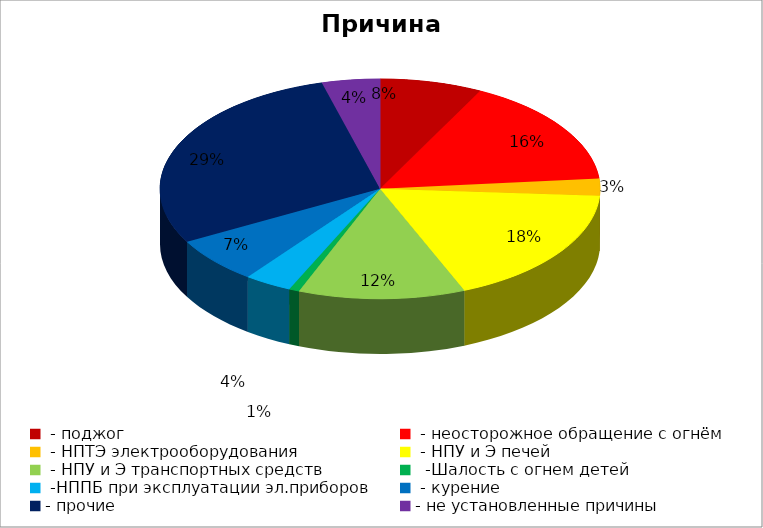
| Category | Причина пожара |
|---|---|
|  - поджог | 30 |
|  - неосторожное обращение с огнём | 64 |
|  - НПТЭ электрооборудования | 10 |
|  - НПУ и Э печей | 71 |
|  - НПУ и Э транспортных средств | 49 |
|   -Шалость с огнем детей | 3 |
|  -НППБ при эксплуатации эл.приборов | 14 |
|  - курение | 27 |
| - прочие | 115 |
| - не установленные причины | 17 |